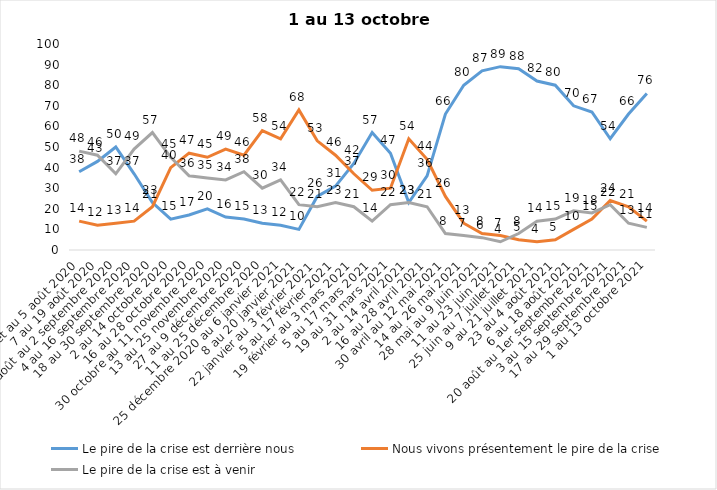
| Category | Le pire de la crise est derrière nous | Nous vivons présentement le pire de la crise | Le pire de la crise est à venir |
|---|---|---|---|
| 24 juillet au 5 août 2020 | 38 | 14 | 48 |
| 7 au 19 août 2020 | 43 | 12 | 46 |
| 21 août au 2 septembre 2020 | 50 | 13 | 37 |
| 4 au 16 septembre 2020 | 37 | 14 | 49 |
| 18 au 30 septembre 2020 | 23 | 21 | 57 |
| 2 au 14 octobre 2020 | 15 | 40 | 45 |
| 16 au 28 octobre 2020 | 17 | 47 | 36 |
| 30 octobre au 11 novembre 2020 | 20 | 45 | 35 |
| 13 au 25 novembre 2020 | 16 | 49 | 34 |
| 27 au 9 décembre 2020 | 15 | 46 | 38 |
| 11 au 25 décembre 2020 | 13 | 58 | 30 |
| 25 décembre 2020 au 6 janvier 2021 | 12 | 54 | 34 |
| 8 au 20 janvier 2021 | 10 | 68 | 22 |
| 22 janvier au 3 février 2021 | 26 | 53 | 21 |
| 5 au 17 février 2021 | 31 | 46 | 23 |
| 19 février au 3 mars 2021 | 42 | 37 | 21 |
| 5 au 17 mars 2021 | 57 | 29 | 14 |
| 19 au 31 mars 2021 | 47 | 30 | 22 |
| 2 au 14 avril 2021 | 23 | 54 | 23 |
| 16 au 28 avril 2021 | 36 | 44 | 21 |
| 30 avril au 12 mai 2021 | 66 | 26 | 8 |
| 14 au 26 mai 2021 | 80 | 13 | 7 |
| 28 mai au 9 juin 2021 | 87 | 8 | 6 |
| 11 au 23 juin 2021 | 89 | 7 | 4 |
| 25 juin au 7 juillet 2021 | 88 | 5 | 8 |
| 9 au 21 juillet 2021 | 82 | 4 | 14 |
| 23 au 4 août 2021 | 80 | 5 | 15 |
| 6 au 18 août 2021 | 70 | 10 | 19 |
| 20 août au 1er septembre 2021 | 67 | 15 | 18 |
| 3 au 15 septembre 2021 | 54 | 24 | 22 |
| 17 au 29 septembre 2021 | 66 | 21 | 13 |
| 1 au 13 octobre 2021 | 76 | 14 | 11 |